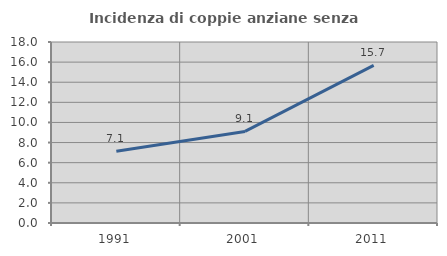
| Category | Incidenza di coppie anziane senza figli  |
|---|---|
| 1991.0 | 7.131 |
| 2001.0 | 9.104 |
| 2011.0 | 15.68 |